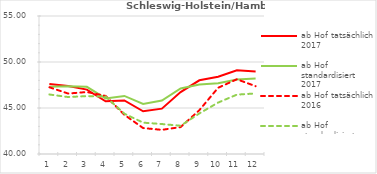
| Category | ab Hof tatsächlich 2017 | ab Hof standardisiert 2017 | ab Hof tatsächlich 2016 | ab Hof standardisiert 2016 |
|---|---|---|---|---|
| 0 | 47.61 | 47.318 | 47.25 | 46.469 |
| 1 | 47.395 | 47.355 | 46.572 | 46.192 |
| 2 | 47 | 47.302 | 46.737 | 46.293 |
| 3 | 45.731 | 46.037 | 46.313 | 46.243 |
| 4 | 45.819 | 46.311 | 44.261 | 44.382 |
| 5 | 44.645 | 45.443 | 42.819 | 43.408 |
| 6 | 44.927 | 45.81 | 42.625 | 43.257 |
| 7 | 46.733 | 47.116 | 42.926 | 43.072 |
| 8 | 48.01 | 47.547 | 44.763 | 44.41 |
| 9 | 48.399 | 47.699 | 47.198 | 45.59 |
| 10 | 49.103 | 48.103 | 48.122 | 46.453 |
| 11 | 48.98 | 48.209 | 47.372 | 46.581 |